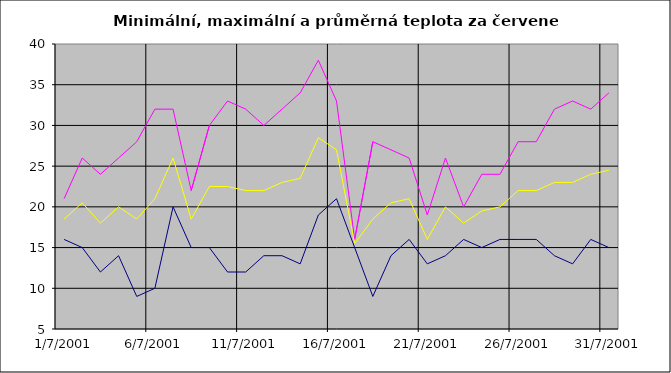
| Category | Series 0 | Series 1 | Series 2 |
|---|---|---|---|
| 2001-07-01 | 16 | 21 | 18.5 |
| 2001-07-02 | 15 | 26 | 20.5 |
| 2001-07-03 | 12 | 24 | 18 |
| 2001-07-04 | 14 | 26 | 20 |
| 2001-07-05 | 9 | 28 | 18.5 |
| 2001-07-06 | 10 | 32 | 21 |
| 2001-07-07 | 20 | 32 | 26 |
| 2001-07-08 | 15 | 22 | 18.5 |
| 2001-07-09 | 15 | 30 | 22.5 |
| 2001-07-10 | 12 | 33 | 22.5 |
| 2001-07-11 | 12 | 32 | 22 |
| 2001-07-12 | 14 | 30 | 22 |
| 2001-07-13 | 14 | 32 | 23 |
| 2001-07-14 | 13 | 34 | 23.5 |
| 2001-07-15 | 19 | 38 | 28.5 |
| 2001-07-16 | 21 | 33 | 27 |
| 2001-07-17 | 15 | 16 | 15.5 |
| 2001-07-18 | 9 | 28 | 18.5 |
| 2001-07-19 | 14 | 27 | 20.5 |
| 2001-07-20 | 16 | 26 | 21 |
| 2001-07-21 | 13 | 19 | 16 |
| 2001-07-22 | 14 | 26 | 20 |
| 2001-07-23 | 16 | 20 | 18 |
| 2001-07-24 | 15 | 24 | 19.5 |
| 2001-07-25 | 16 | 24 | 20 |
| 2001-07-26 | 16 | 28 | 22 |
| 2001-07-27 | 16 | 28 | 22 |
| 2001-07-28 | 14 | 32 | 23 |
| 2001-07-29 | 13 | 33 | 23 |
| 2001-07-30 | 16 | 32 | 24 |
| 2001-07-31 | 15 | 34 | 24.5 |